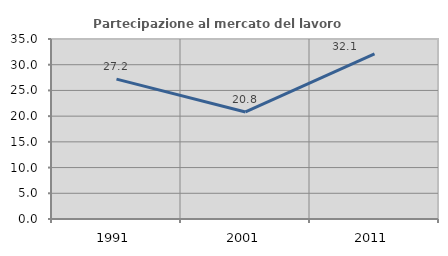
| Category | Partecipazione al mercato del lavoro  femminile |
|---|---|
| 1991.0 | 27.197 |
| 2001.0 | 20.812 |
| 2011.0 | 32.121 |